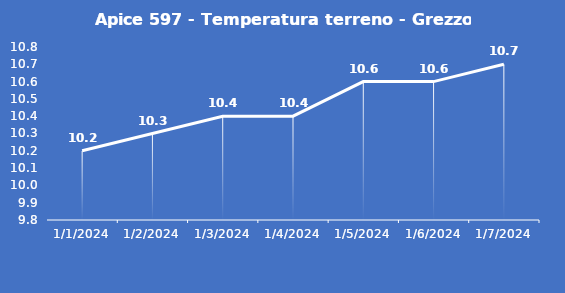
| Category | Apice 597 - Temperatura terreno - Grezzo (°C) |
|---|---|
| 1/1/24 | 10.2 |
| 1/2/24 | 10.3 |
| 1/3/24 | 10.4 |
| 1/4/24 | 10.4 |
| 1/5/24 | 10.6 |
| 1/6/24 | 10.6 |
| 1/7/24 | 10.7 |